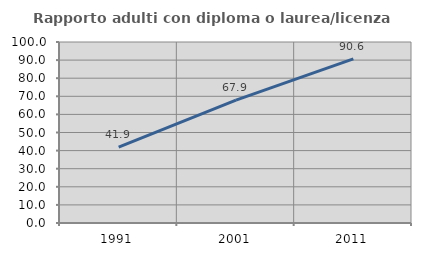
| Category | Rapporto adulti con diploma o laurea/licenza media  |
|---|---|
| 1991.0 | 41.949 |
| 2001.0 | 67.919 |
| 2011.0 | 90.633 |